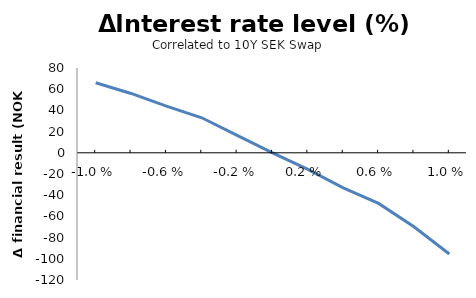
| Category | Series 0 |
|---|---|
| -0.01 | 66.087 |
| -0.008 | 55.99 |
| -0.006 | 44.058 |
| -0.004 | 33.043 |
| -0.002 | 16.522 |
| 0.0 | 0 |
| 0.002 | -15.604 |
| 0.004 | -33.043 |
| 0.006 | -47.729 |
| 0.008 | -69.758 |
| 0.01 | -95.459 |